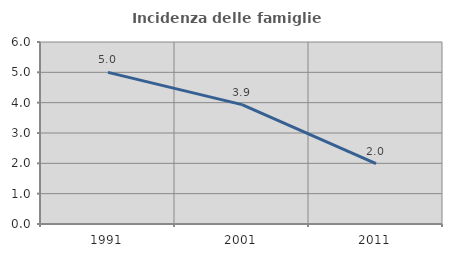
| Category | Incidenza delle famiglie numerose |
|---|---|
| 1991.0 | 5 |
| 2001.0 | 3.934 |
| 2011.0 | 1.994 |